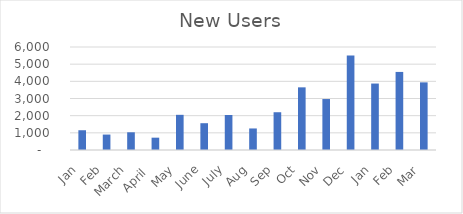
| Category | New Users |
|---|---|
|  Jan  | 1151 |
|  Feb  | 899 |
|  March  | 1032 |
|  April   | 718 |
|  May  | 2049 |
|  June  | 1561 |
|  July  | 2039 |
|  Aug  | 1255 |
|  Sep  | 2200 |
|  Oct  | 3650 |
|  Nov  | 2969 |
|  Dec  | 5502 |
|  Jan  | 3871 |
|  Feb  | 4548 |
|  Mar  | 3940 |